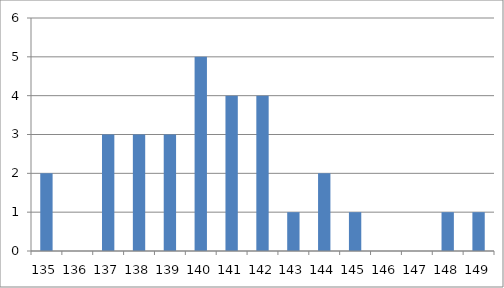
| Category | Høyde |
|---|---|
| 135.0 | 2 |
| 136.0 | 0 |
| 137.0 | 3 |
| 138.0 | 3 |
| 139.0 | 3 |
| 140.0 | 5 |
| 141.0 | 4 |
| 142.0 | 4 |
| 143.0 | 1 |
| 144.0 | 2 |
| 145.0 | 1 |
| 146.0 | 0 |
| 147.0 | 0 |
| 148.0 | 1 |
| 149.0 | 1 |